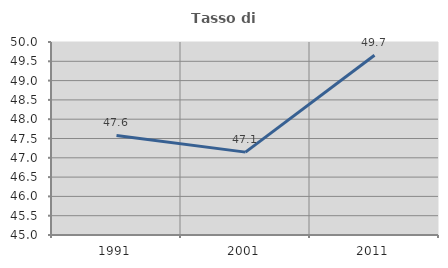
| Category | Tasso di occupazione   |
|---|---|
| 1991.0 | 47.58 |
| 2001.0 | 47.147 |
| 2011.0 | 49.658 |